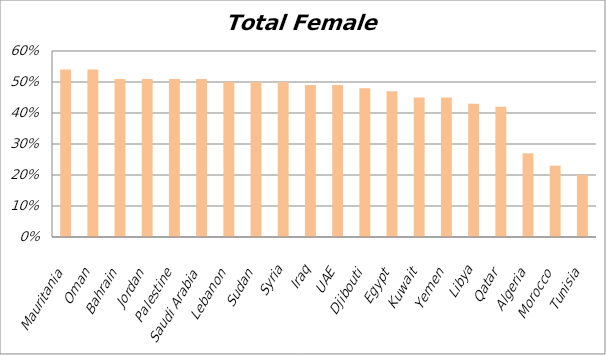
| Category | Series 0 |
|---|---|
| Mauritania | 0.54 |
| Oman | 0.54 |
| Bahrain | 0.51 |
| Jordan | 0.51 |
| Palestine | 0.51 |
| Saudi Arabia | 0.51 |
| Lebanon | 0.5 |
| Sudan | 0.5 |
| Syria | 0.5 |
| Iraq | 0.49 |
| UAE | 0.49 |
| Djibouti | 0.48 |
| Egypt | 0.47 |
| Kuwait | 0.45 |
| Yemen | 0.45 |
| Libya | 0.43 |
| Qatar | 0.42 |
| Algeria | 0.27 |
| Morocco | 0.23 |
| Tunisia | 0.2 |